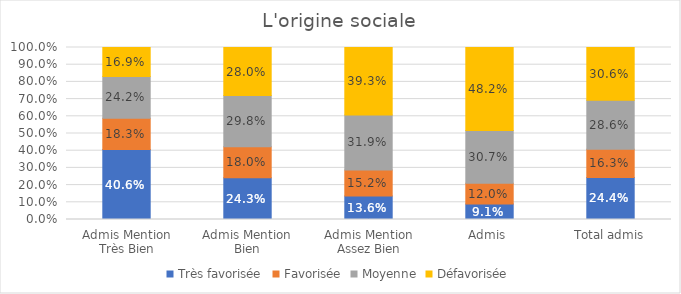
| Category | Très favorisée | Favorisée | Moyenne | Défavorisée |
|---|---|---|---|---|
| Admis Mention Très Bien | 0.406 | 0.183 | 0.242 | 0.169 |
| Admis Mention Bien | 0.243 | 0.18 | 0.298 | 0.28 |
| Admis Mention Assez Bien | 0.136 | 0.152 | 0.319 | 0.393 |
| Admis | 0.091 | 0.12 | 0.307 | 0.482 |
| Total admis | 0.244 | 0.163 | 0.286 | 0.306 |